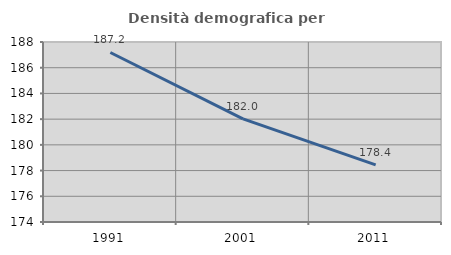
| Category | Densità demografica |
|---|---|
| 1991.0 | 187.186 |
| 2001.0 | 182.027 |
| 2011.0 | 178.437 |